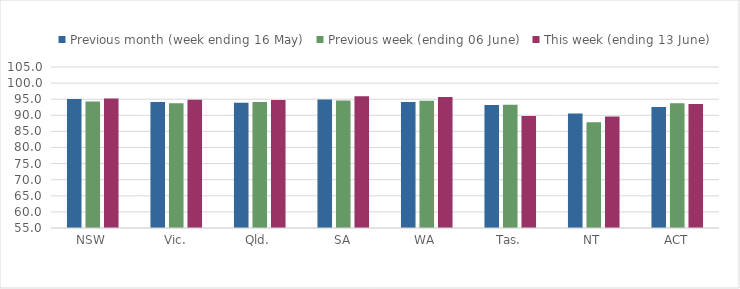
| Category | Previous month (week ending 16 May) | Previous week (ending 06 June) | This week (ending 13 June) |
|---|---|---|---|
| NSW | 95.087 | 94.309 | 95.249 |
| Vic. | 94.168 | 93.77 | 94.821 |
| Qld. | 93.917 | 94.12 | 94.736 |
| SA | 94.898 | 94.592 | 95.895 |
| WA | 94.128 | 94.557 | 95.652 |
| Tas. | 93.2 | 93.3 | 89.76 |
| NT | 90.559 | 87.879 | 89.636 |
| ACT | 92.601 | 93.757 | 93.51 |